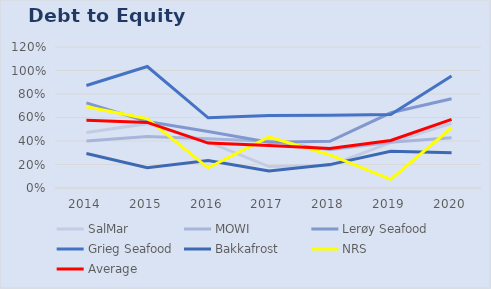
| Category | SalMar | MOWI | Lerøy Seafood | Grieg Seafood | Bakkafrost | NRS | Average |
|---|---|---|---|---|---|---|---|
| 2014.0 | 0.473 | 0.401 | 0.724 | 0.872 | 0.293 | 0.691 | 0.576 |
| 2015.0 | 0.548 | 0.438 | 0.565 | 1.034 | 0.173 | 0.59 | 0.558 |
| 2016.0 | 0.392 | 0.418 | 0.48 | 0.597 | 0.233 | 0.172 | 0.382 |
| 2017.0 | 0.182 | 0.399 | 0.39 | 0.617 | 0.145 | 0.434 | 0.361 |
| 2018.0 | 0.192 | 0.326 | 0.397 | 0.618 | 0.199 | 0.282 | 0.336 |
| 2019.0 | 0.386 | 0.389 | 0.64 | 0.626 | 0.313 | 0.074 | 0.405 |
| 2020.0 | 0.551 | 0.428 | 0.759 | 0.953 | 0.3 | 0.513 | 0.584 |